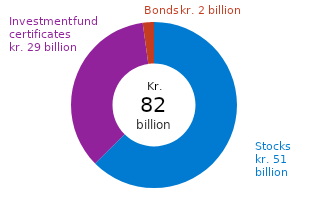
| Category | Return, kr. billion |
|---|---|
| Listed stocks | 51.367 |
| Investment fund certificates | 28.973 |
| Bonds | 1.791 |